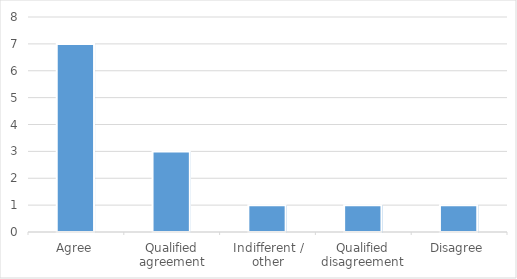
| Category | Series 0 |
|---|---|
| Agree | 7 |
| Qualified agreement | 3 |
| Indifferent / other | 1 |
| Qualified disagreement | 1 |
| Disagree | 1 |